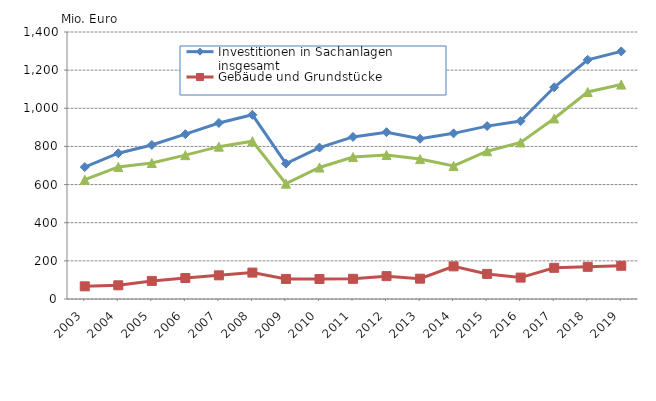
| Category | Investitionen in Sachanlagen insgesamt | Gebäude und Grundstücke | Maschinen und Betriebsausstattung |
|---|---|---|---|
| 2003.0 | 691840 | 66441 | 625399 |
| 2004.0 | 764337 | 71810 | 692527 |
| 2005.0 | 807730 | 94864 | 712866 |
| 2006.0 | 864202 | 109907 | 754295 |
| 2007.0 | 922931 | 124199 | 798732 |
| 2008.0 | 965705 | 138389 | 827316 |
| 2009.0 | 710022 | 105189 | 604833 |
| 2010.0 | 794111 | 104710 | 689400 |
| 2011.0 | 849848.946 | 105760 | 744088.575 |
| 2012.0 | 874647.991 | 119797 | 754850.66 |
| 2013.0 | 840136.552 | 106586 | 733550.844 |
| 2014.0 | 868614.61 | 171128 | 697486.539 |
| 2015.0 | 906511.133 | 131559.378 | 774951.755 |
| 2016.0 | 933005.993 | 112203.211 | 820802.782 |
| 2017.0 | 1110213.856 | 163523.751 | 946690.105 |
| 2018.0 | 1254089.769 | 168719.773 | 1085369.996 |
| 2019.0 | 1298298.969 | 173995.131 | 1124303.838 |